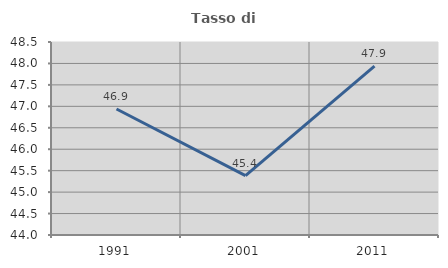
| Category | Tasso di occupazione   |
|---|---|
| 1991.0 | 46.939 |
| 2001.0 | 45.385 |
| 2011.0 | 47.939 |